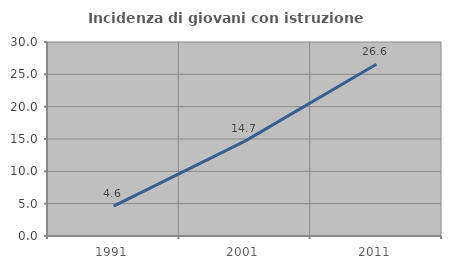
| Category | Incidenza di giovani con istruzione universitaria |
|---|---|
| 1991.0 | 4.615 |
| 2001.0 | 14.672 |
| 2011.0 | 26.554 |